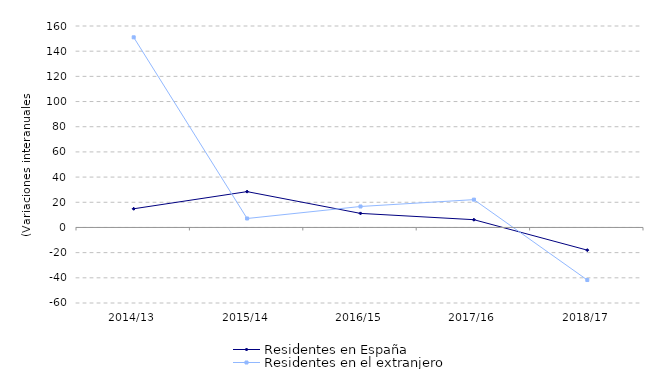
| Category | Residentes en España | Residentes en el extranjero |
|---|---|---|
| 2014/13 | 14.839 | 151.011 |
| 2015/14 | 28.45 | 7.12 |
| 2016/15 | 11.166 | 16.649 |
| 2017/16 | 6.165 | 22.1 |
| 2018/17 | -18.029 | -41.755 |